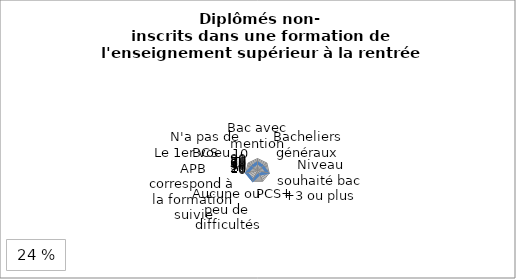
| Category | Diplômés non inscrits dans une formation de l'enseignement supérieur à la rentrée 2017 |
|---|---|
| Bac avec mention | 65 |
| Bacheliers généraux | 55.6 |
| Niveau souhaité bac +3 ou plus | 84.3 |
| PCS+ | 33.8 |
| Aucune ou peu de difficultés | 90.7 |
| Le 1er voeu APB correspond à la formation suivie | 92.9 |
| N'a pas de BCS | 53.2 |